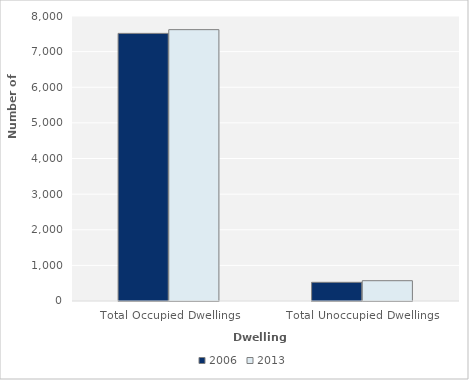
| Category | 2006 | 2013 |
|---|---|---|
| Total Occupied Dwellings | 7512 | 7617 |
| Total Unoccupied Dwellings | 525 | 570 |